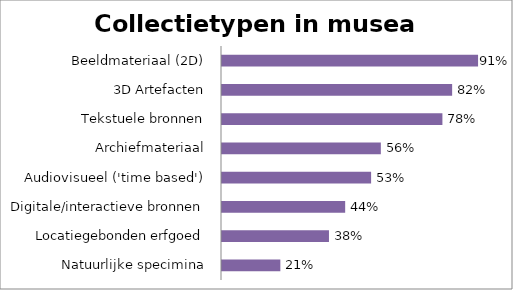
| Category | Musea (n=87) |
|---|---|
| Natuurlijke specimina | 0.207 |
| Locatiegebonden erfgoed | 0.379 |
| Digitale/interactieve bronnen | 0.437 |
| Audiovisueel ('time based') | 0.529 |
| Archiefmateriaal | 0.563 |
| Tekstuele bronnen | 0.782 |
| 3D Artefacten | 0.816 |
| Beeldmateriaal (2D) | 0.908 |